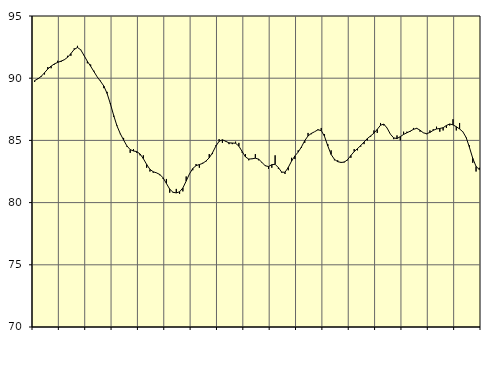
| Category | Piggar | Series 1 |
|---|---|---|
| nan | 89.7 | 89.81 |
| 87.0 | 90 | 89.95 |
| 87.0 | 90.1 | 90.15 |
| 87.0 | 90.3 | 90.44 |
| nan | 90.9 | 90.74 |
| 88.0 | 90.8 | 90.97 |
| 88.0 | 91.1 | 91.15 |
| 88.0 | 91.4 | 91.27 |
| nan | 91.3 | 91.37 |
| 89.0 | 91.5 | 91.48 |
| 89.0 | 91.8 | 91.68 |
| 89.0 | 91.8 | 91.98 |
| nan | 92.4 | 92.31 |
| 90.0 | 92.6 | 92.47 |
| 90.0 | 92.3 | 92.28 |
| 90.0 | 91.8 | 91.82 |
| nan | 91.2 | 91.36 |
| 91.0 | 91.1 | 90.96 |
| 91.0 | 90.6 | 90.53 |
| 91.0 | 90.1 | 90.1 |
| nan | 89.8 | 89.75 |
| 92.0 | 89.2 | 89.37 |
| 92.0 | 88.9 | 88.77 |
| 92.0 | 88 | 87.93 |
| nan | 86.9 | 87 |
| 93.0 | 86.2 | 86.16 |
| 93.0 | 85.5 | 85.54 |
| 93.0 | 85.2 | 85.03 |
| nan | 84.5 | 84.56 |
| 94.0 | 84 | 84.26 |
| 94.0 | 84.3 | 84.15 |
| 94.0 | 84 | 84.1 |
| nan | 83.8 | 83.91 |
| 95.0 | 83.8 | 83.53 |
| 95.0 | 82.8 | 83.07 |
| 95.0 | 82.5 | 82.67 |
| nan | 82.4 | 82.48 |
| 96.0 | 82.4 | 82.39 |
| 96.0 | 82.2 | 82.26 |
| 96.0 | 81.9 | 81.99 |
| nan | 81.9 | 81.54 |
| 97.0 | 80.8 | 81.08 |
| 97.0 | 80.8 | 80.83 |
| 97.0 | 81.1 | 80.78 |
| nan | 80.7 | 80.87 |
| 98.0 | 80.9 | 81.18 |
| 98.0 | 82.1 | 81.73 |
| 98.0 | 82.3 | 82.31 |
| nan | 82.6 | 82.74 |
| 99.0 | 83.1 | 82.97 |
| 99.0 | 82.8 | 83.06 |
| 99.0 | 83.2 | 83.15 |
| nan | 83.3 | 83.34 |
| 0.0 | 83.9 | 83.6 |
| 0.0 | 83.9 | 84.01 |
| 0.0 | 84.6 | 84.53 |
| nan | 85.1 | 84.93 |
| 1.0 | 84.8 | 85.05 |
| 1.0 | 84.9 | 84.93 |
| 1.0 | 84.7 | 84.8 |
| nan | 84.7 | 84.79 |
| 2.0 | 84.9 | 84.77 |
| 2.0 | 84.8 | 84.54 |
| 2.0 | 84 | 84.1 |
| nan | 83.9 | 83.67 |
| 3.0 | 83.4 | 83.5 |
| 3.0 | 83.5 | 83.52 |
| 3.0 | 83.9 | 83.57 |
| nan | 83.4 | 83.49 |
| 4.0 | 83.2 | 83.23 |
| 4.0 | 83 | 82.96 |
| 4.0 | 82.7 | 82.9 |
| nan | 82.8 | 83.05 |
| 5.0 | 83.8 | 83.08 |
| 5.0 | 82.7 | 82.81 |
| 5.0 | 82.4 | 82.45 |
| nan | 82.3 | 82.44 |
| 6.0 | 82.6 | 82.83 |
| 6.0 | 83.6 | 83.34 |
| 6.0 | 83.5 | 83.75 |
| nan | 84.2 | 84.06 |
| 7.0 | 84.4 | 84.48 |
| 7.0 | 84.8 | 84.98 |
| 7.0 | 85.6 | 85.36 |
| nan | 85.5 | 85.56 |
| 8.0 | 85.7 | 85.7 |
| 8.0 | 85.9 | 85.85 |
| 8.0 | 86 | 85.79 |
| nan | 85.5 | 85.32 |
| 9.0 | 84.7 | 84.55 |
| 9.0 | 84.2 | 83.87 |
| 9.0 | 83.4 | 83.48 |
| nan | 83.4 | 83.29 |
| 10.0 | 83.2 | 83.23 |
| 10.0 | 83.3 | 83.25 |
| 10.0 | 83.4 | 83.45 |
| nan | 83.6 | 83.79 |
| 11.0 | 84.3 | 84.1 |
| 11.0 | 84.2 | 84.34 |
| 11.0 | 84.5 | 84.59 |
| nan | 84.7 | 84.87 |
| 12.0 | 85 | 85.15 |
| 12.0 | 85.3 | 85.36 |
| 12.0 | 85.8 | 85.58 |
| nan | 85.6 | 85.89 |
| 13.0 | 86.4 | 86.22 |
| 13.0 | 86.2 | 86.31 |
| 13.0 | 86 | 85.99 |
| nan | 85.5 | 85.5 |
| 14.0 | 85.1 | 85.2 |
| 14.0 | 85.4 | 85.15 |
| 14.0 | 85 | 85.3 |
| nan | 85.7 | 85.48 |
| 15.0 | 85.7 | 85.61 |
| 15.0 | 85.7 | 85.74 |
| 15.0 | 86 | 85.89 |
| nan | 86 | 85.97 |
| 16.0 | 85.7 | 85.82 |
| 16.0 | 85.6 | 85.61 |
| 16.0 | 85.5 | 85.54 |
| nan | 85.8 | 85.64 |
| 17.0 | 85.9 | 85.81 |
| 17.0 | 86.1 | 85.92 |
| 17.0 | 85.7 | 85.96 |
| nan | 85.8 | 86.02 |
| 18.0 | 86 | 86.2 |
| 18.0 | 86.2 | 86.32 |
| 18.0 | 86.7 | 86.25 |
| nan | 85.8 | 86.1 |
| 19.0 | 86.4 | 85.92 |
| 19.0 | 85.7 | 85.69 |
| 19.0 | 85.2 | 85.23 |
| nan | 84.6 | 84.43 |
| 20.0 | 83.2 | 83.56 |
| 20.0 | 82.5 | 82.91 |
| 20.0 | 82.8 | 82.65 |